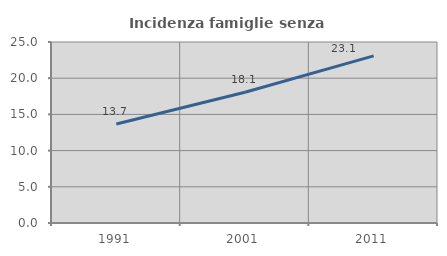
| Category | Incidenza famiglie senza nuclei |
|---|---|
| 1991.0 | 13.683 |
| 2001.0 | 18.056 |
| 2011.0 | 23.091 |